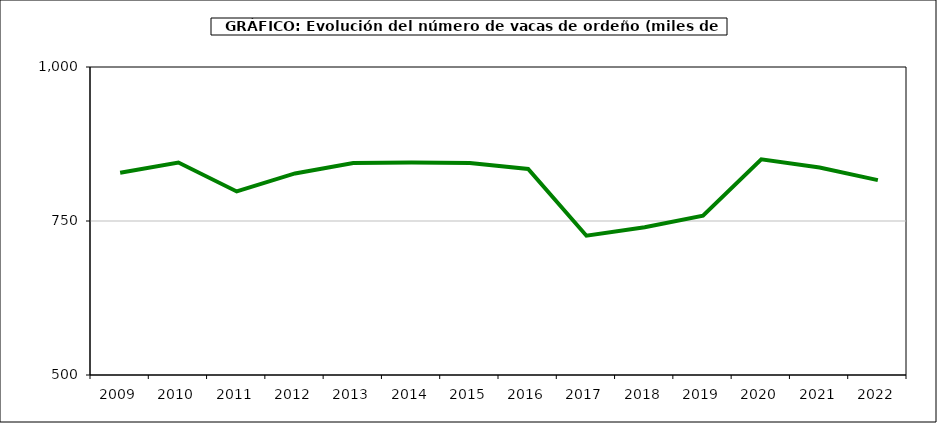
| Category | Leche de vaca |
|---|---|
| 2009.0 | 828.347 |
| 2010.0 | 845 |
| 2011.0 | 798 |
| 2012.0 | 827.207 |
| 2013.0 | 844.06 |
| 2014.0 | 844.79 |
| 2015.0 | 844.114 |
| 2016.0 | 834.453 |
| 2017.0 | 726.131 |
| 2018.0 | 739.757 |
| 2019.0 | 758.569 |
| 2020.0 | 850.102 |
| 2021.0 | 836.965 |
| 2022.0 | 816.351 |